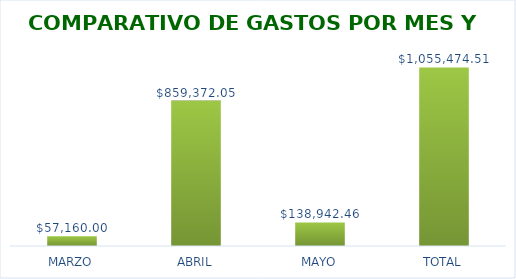
| Category | Series 0 |
|---|---|
| MARZO | 57160 |
| ABRIL | 859372.05 |
| MAYO | 138942.46 |
| TOTAL | 1055474.51 |